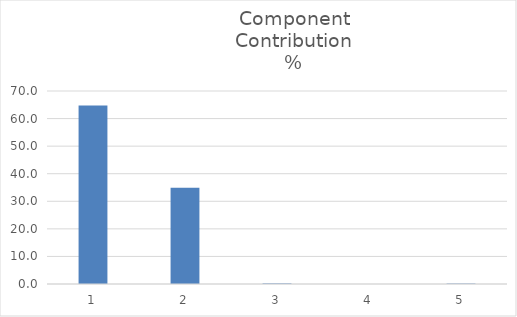
| Category | Component
Contribution
% |
|---|---|
| 0 | 64.76 |
| 1 | 34.874 |
| 2 | 0.21 |
| 3 | 0.001 |
| 4 | 0.155 |